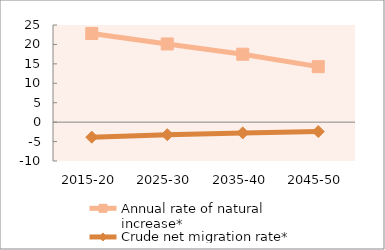
| Category | Annual rate of natural increase* | Crude net migration rate* |
|---|---|---|
| 2015-20 | 22.811 | -3.869 |
| 2025-30 | 20.127 | -3.237 |
| 2035-40 | 17.477 | -2.763 |
| 2045-50 | 14.283 | -2.419 |